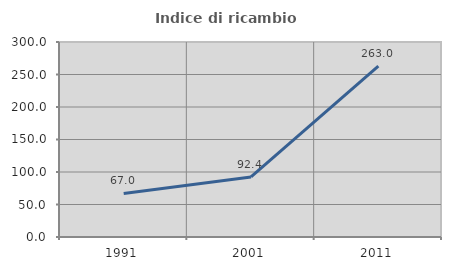
| Category | Indice di ricambio occupazionale  |
|---|---|
| 1991.0 | 67.039 |
| 2001.0 | 92.424 |
| 2011.0 | 263.043 |